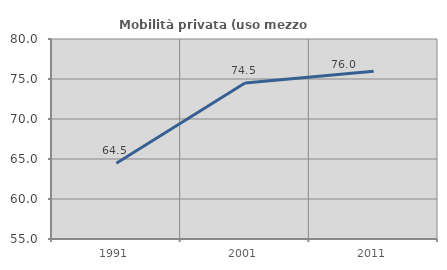
| Category | Mobilità privata (uso mezzo privato) |
|---|---|
| 1991.0 | 64.457 |
| 2001.0 | 74.495 |
| 2011.0 | 75.959 |